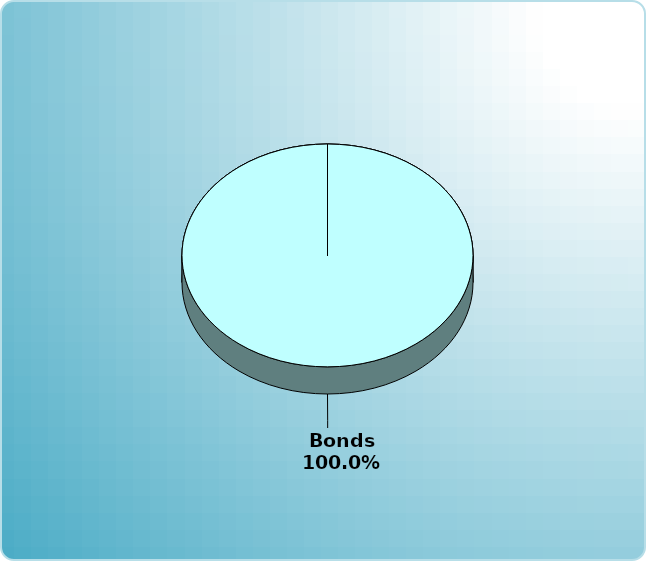
| Category | Series 0 |
|---|---|
| Cash | 0 |
| Bonds | 25000 |
| Muni Bond | 0 |
| Hybrid bond | 0 |
| Value | 0 |
| Growth | 0 |
| Small-Cap | 0 |
| Tangibles | 0 |
| International | 0 |
| Personal Property | 0 |
| Miscellaneous | 0 |